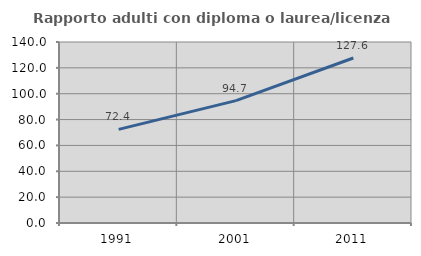
| Category | Rapporto adulti con diploma o laurea/licenza media  |
|---|---|
| 1991.0 | 72.414 |
| 2001.0 | 94.656 |
| 2011.0 | 127.621 |